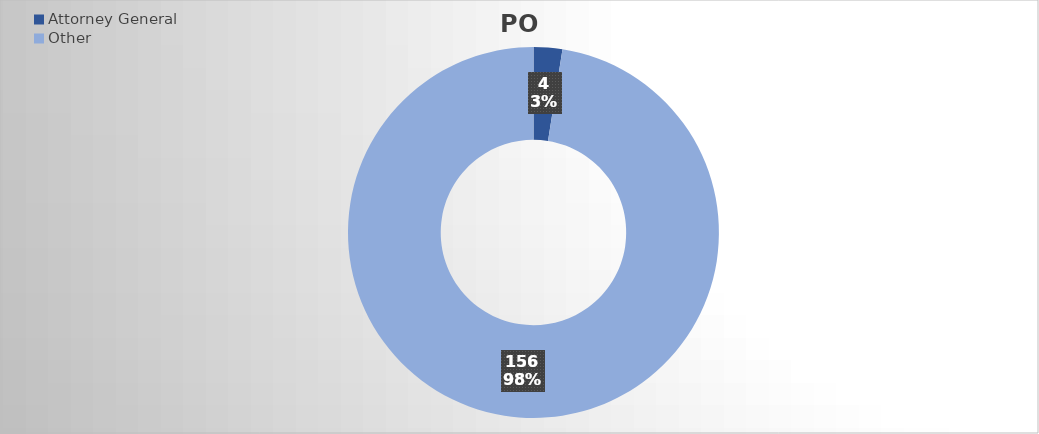
| Category | PO Lines |
|---|---|
| Attorney General | 4 |
| Other | 156 |